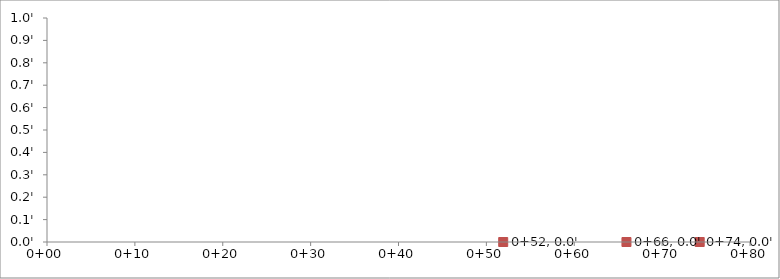
| Category | Series 1 |
|---|---|
| 51.91551978593457 | 0 |
| 74.27559121046629 | 0 |
| 65.9406207800216 | 0 |